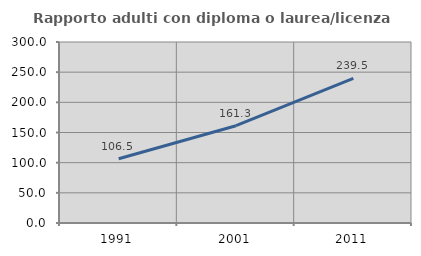
| Category | Rapporto adulti con diploma o laurea/licenza media  |
|---|---|
| 1991.0 | 106.476 |
| 2001.0 | 161.273 |
| 2011.0 | 239.536 |